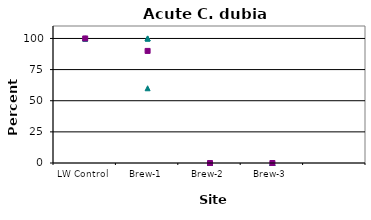
| Category | Series 0 | Series 1 | Series 2 | Series 3 | Series 4 |
|---|---|---|---|---|---|
| LW Control | 100 | 100 | 100 | 100 | 100 |
| Brew-1 | 100 | 100 | 60 | 100 | 90 |
| Brew-2 | 0 | 0 | 0 | 0 | 0 |
| Brew-3 | 0 | 0 | 0 | 0 | 0 |